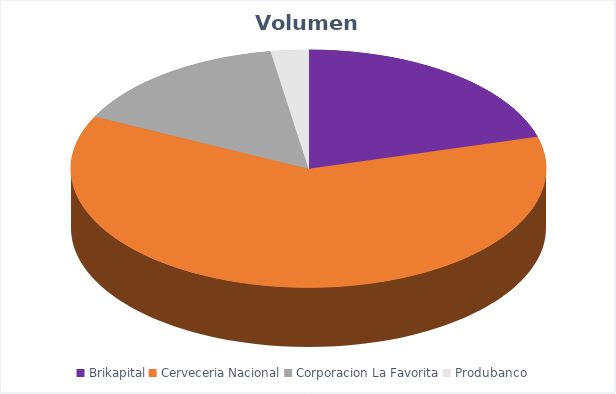
| Category | VOLUMEN ($USD) |
|---|---|
| Brikapital | 21000 |
| Cerveceria Nacional | 62560 |
| Corporacion La Favorita | 15466.85 |
| Produbanco | 2600 |